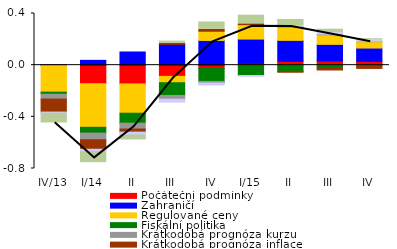
| Category | Počáteční podmínky | Zahraničí | Regulované ceny | Fiskální politika | Krátkodobá prognóza kurzu | Krátkodobá prognóza inflace | Expertní úpravy | Modelová změna |
|---|---|---|---|---|---|---|---|---|
| IV/13 | 0.002 | -0.003 | -0.206 | -0.015 | -0.038 | -0.101 | -0.009 | -0.075 |
| I/14 | -0.145 | 0.037 | -0.336 | -0.045 | -0.051 | -0.074 | -0.018 | -0.086 |
| II | -0.145 | 0.102 | -0.227 | -0.077 | -0.045 | -0.024 | -0.023 | -0.038 |
| III | -0.087 | 0.161 | -0.049 | -0.098 | -0.029 | 0.008 | -0.022 | 0.017 |
| IV | -0.026 | 0.191 | 0.071 | -0.1 | -0.012 | 0.015 | -0.015 | 0.057 |
| I/15 | 0.014 | 0.188 | 0.111 | -0.08 | 0 | 0.006 | -0.006 | 0.067 |
| II | 0.03 | 0.162 | 0.101 | -0.048 | 0.006 | -0.007 | 0.004 | 0.051 |
| III | 0.032 | 0.129 | 0.074 | -0.02 | 0.006 | -0.017 | 0.011 | 0.027 |
| IV | 0.03 | 0.103 | 0.049 | -0.002 | 0.003 | -0.023 | 0.015 | 0.006 |